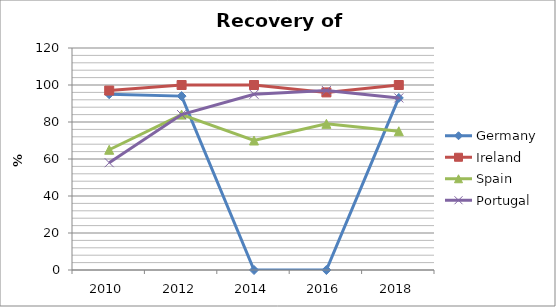
| Category | Germany | Ireland | Spain | Portugal |
|---|---|---|---|---|
| 2010 | 95 | 97 | 65 | 58 |
| 2012 | 94 | 100 | 84 | 84 |
| 2014 | 0 | 100 | 70 | 95 |
| 2016 | 0 | 96 | 79 | 97 |
| 2018 | 93 | 100 | 75 | 93 |